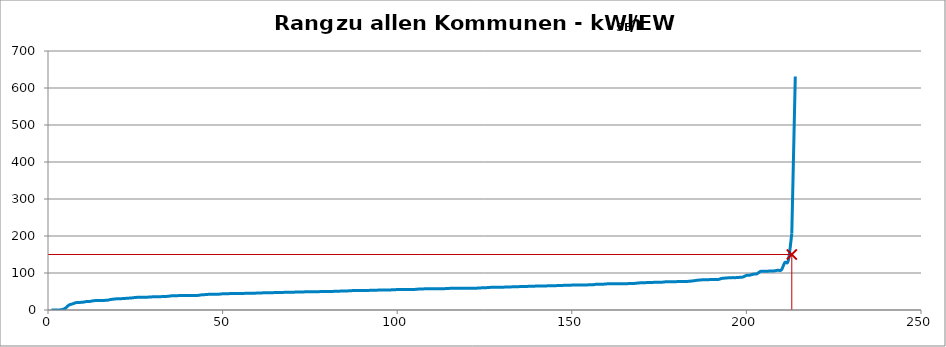
| Category | Kommunenrangfolge |
|---|---|
| 0 | 0.048 |
| 1 | 0.077 |
| 2 | 0.078 |
| 3 | 1.043 |
| 4 | 5.128 |
| 5 | 13.316 |
| 6 | 16.384 |
| 7 | 19.788 |
| 8 | 20.44 |
| 9 | 21.058 |
| 10 | 22.846 |
| 11 | 23.247 |
| 12 | 24.938 |
| 13 | 25.656 |
| 14 | 25.79 |
| 15 | 25.948 |
| 16 | 26.432 |
| 17 | 28.429 |
| 18 | 29.622 |
| 19 | 30.41 |
| 20 | 30.641 |
| 21 | 31.283 |
| 22 | 31.959 |
| 23 | 32.653 |
| 24 | 33.865 |
| 25 | 34.386 |
| 26 | 34.687 |
| 27 | 34.692 |
| 28 | 34.905 |
| 29 | 35.62 |
| 30 | 35.721 |
| 31 | 35.885 |
| 32 | 36.424 |
| 33 | 36.71 |
| 34 | 37.91 |
| 35 | 38.783 |
| 36 | 38.786 |
| 37 | 39.008 |
| 38 | 39.095 |
| 39 | 39.204 |
| 40 | 39.284 |
| 41 | 39.315 |
| 42 | 39.559 |
| 43 | 40.978 |
| 44 | 41.584 |
| 45 | 42.333 |
| 46 | 42.338 |
| 47 | 42.537 |
| 48 | 42.804 |
| 49 | 43.739 |
| 50 | 43.857 |
| 51 | 44.258 |
| 52 | 44.267 |
| 53 | 44.389 |
| 54 | 44.429 |
| 55 | 44.864 |
| 56 | 45.006 |
| 57 | 45.057 |
| 58 | 45.244 |
| 59 | 45.982 |
| 60 | 46.12 |
| 61 | 46.517 |
| 62 | 46.559 |
| 63 | 46.653 |
| 64 | 47.136 |
| 65 | 47.359 |
| 66 | 47.362 |
| 67 | 47.885 |
| 68 | 48.058 |
| 69 | 48.126 |
| 70 | 48.429 |
| 71 | 48.689 |
| 72 | 48.932 |
| 73 | 49.05 |
| 74 | 49.107 |
| 75 | 49.436 |
| 76 | 49.492 |
| 77 | 49.713 |
| 78 | 49.811 |
| 79 | 49.976 |
| 80 | 50.1 |
| 81 | 50.43 |
| 82 | 50.855 |
| 83 | 51.111 |
| 84 | 51.301 |
| 85 | 51.685 |
| 86 | 52.329 |
| 87 | 52.546 |
| 88 | 52.582 |
| 89 | 52.948 |
| 90 | 53.025 |
| 91 | 53.036 |
| 92 | 53.485 |
| 93 | 53.686 |
| 94 | 53.735 |
| 95 | 53.82 |
| 96 | 54.174 |
| 97 | 54.226 |
| 98 | 54.892 |
| 99 | 55.111 |
| 100 | 55.141 |
| 101 | 55.356 |
| 102 | 55.37 |
| 103 | 55.388 |
| 104 | 55.599 |
| 105 | 56.478 |
| 106 | 56.852 |
| 107 | 57.189 |
| 108 | 57.2 |
| 109 | 57.209 |
| 110 | 57.48 |
| 111 | 57.506 |
| 112 | 57.514 |
| 113 | 57.896 |
| 114 | 58.456 |
| 115 | 58.502 |
| 116 | 58.755 |
| 117 | 58.813 |
| 118 | 58.824 |
| 119 | 58.836 |
| 120 | 58.892 |
| 121 | 58.997 |
| 122 | 59.144 |
| 123 | 59.766 |
| 124 | 60 |
| 125 | 60.68 |
| 126 | 61.358 |
| 127 | 61.472 |
| 128 | 61.603 |
| 129 | 61.706 |
| 130 | 61.883 |
| 131 | 62.121 |
| 132 | 62.617 |
| 133 | 62.691 |
| 134 | 63.197 |
| 135 | 63.273 |
| 136 | 63.615 |
| 137 | 64.173 |
| 138 | 64.245 |
| 139 | 64.803 |
| 140 | 64.809 |
| 141 | 64.89 |
| 142 | 65.232 |
| 143 | 65.294 |
| 144 | 65.331 |
| 145 | 66.198 |
| 146 | 66.485 |
| 147 | 66.622 |
| 148 | 66.858 |
| 149 | 67.254 |
| 150 | 67.338 |
| 151 | 67.645 |
| 152 | 67.669 |
| 153 | 67.716 |
| 154 | 68.051 |
| 155 | 68.201 |
| 156 | 69.482 |
| 157 | 69.652 |
| 158 | 69.711 |
| 159 | 70.603 |
| 160 | 70.688 |
| 161 | 70.693 |
| 162 | 70.77 |
| 163 | 70.922 |
| 164 | 71.042 |
| 165 | 71.248 |
| 166 | 71.785 |
| 167 | 71.886 |
| 168 | 72.965 |
| 169 | 73.657 |
| 170 | 73.848 |
| 171 | 74.41 |
| 172 | 74.5 |
| 173 | 74.936 |
| 174 | 74.95 |
| 175 | 75.285 |
| 176 | 76.336 |
| 177 | 76.555 |
| 178 | 76.649 |
| 179 | 76.66 |
| 180 | 77.133 |
| 181 | 77.145 |
| 182 | 77.218 |
| 183 | 77.993 |
| 184 | 79.061 |
| 185 | 80.459 |
| 186 | 81.365 |
| 187 | 81.475 |
| 188 | 82.022 |
| 189 | 82.133 |
| 190 | 82.281 |
| 191 | 82.571 |
| 192 | 85.476 |
| 193 | 86.289 |
| 194 | 87.138 |
| 195 | 87.49 |
| 196 | 87.498 |
| 197 | 88.229 |
| 198 | 89.079 |
| 199 | 93.463 |
| 200 | 94.237 |
| 201 | 96.791 |
| 202 | 97.782 |
| 203 | 104.226 |
| 204 | 104.416 |
| 205 | 104.891 |
| 206 | 105.479 |
| 207 | 105.716 |
| 208 | 107.527 |
| 209 | 108.03 |
| 210 | 128.282 |
| 211 | 133.482 |
| 212 | 206.612 |
| 213 | 631.164 |